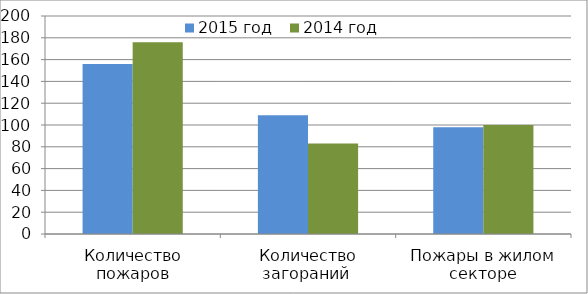
| Category | 2015 год | 2014 год |
|---|---|---|
| Количество пожаров | 156 | 176 |
| Количество загораний  | 109 | 83 |
| Пожары в жилом секторе | 98 | 100 |